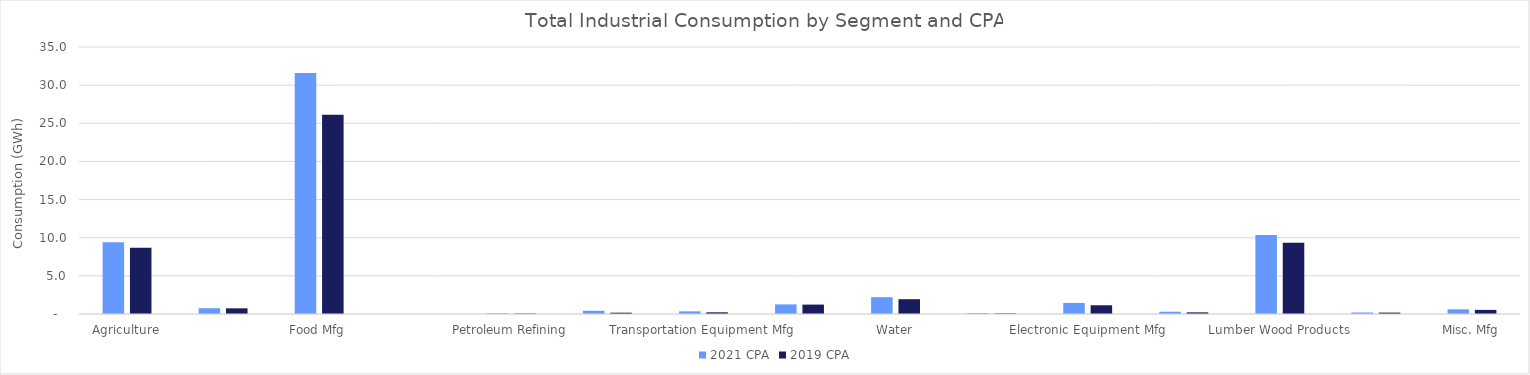
| Category | 2021 CPA | 2019 CPA |
|---|---|---|
| Agriculture | 9.408 | 8.7 |
| Mining | 0.759 | 0.743 |
| Food Mfg | 31.585 | 26.125 |
| Paper Mfg | 0.002 | 0.003 |
| Petroleum Refining | 0.104 | 0.068 |
| Stone Clay Glass Products | 0.421 | 0.174 |
| Transportation Equipment Mfg | 0.347 | 0.221 |
| Wastewater | 1.257 | 1.232 |
| Water | 2.204 | 1.94 |
| Chemical Mfg | 0.114 | 0.079 |
| Electronic Equipment Mfg | 1.453 | 1.145 |
| Industrial Machinery | 0.298 | 0.215 |
| Lumber Wood Products | 10.35 | 9.329 |
| Metal Mfg | 0.201 | 0.185 |
| Misc. Mfg | 0.617 | 0.539 |